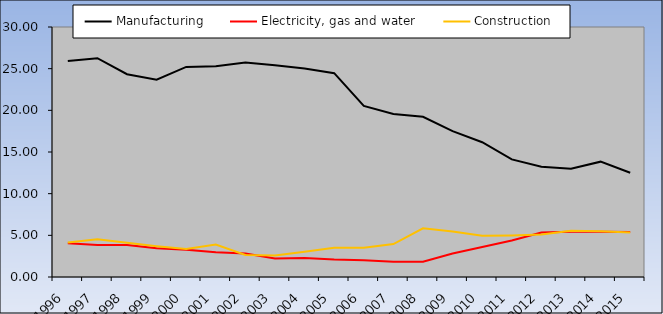
| Category | Manufacturing | Electricity, gas and water | Construction |
|---|---|---|---|
| 1996.0 | 25.912 | 4.046 | 4.13 |
| 1997.0 | 26.254 | 3.839 | 4.526 |
| 1998.0 | 24.332 | 3.825 | 4.102 |
| 1999.0 | 23.687 | 3.458 | 3.696 |
| 2000.0 | 25.213 | 3.273 | 3.37 |
| 2001.0 | 25.295 | 2.956 | 3.886 |
| 2002.0 | 25.729 | 2.829 | 2.638 |
| 2003.0 | 25.418 | 2.232 | 2.595 |
| 2004.0 | 25.006 | 2.279 | 3.03 |
| 2005.0 | 24.459 | 2.093 | 3.495 |
| 2006.0 | 20.522 | 2.021 | 3.499 |
| 2007.0 | 19.557 | 1.834 | 3.957 |
| 2008.0 | 19.218 | 1.826 | 5.841 |
| 2009.0 | 17.509 | 2.821 | 5.471 |
| 2010.0 | 16.176 | 3.595 | 4.943 |
| 2011.0 | 14.113 | 4.373 | 4.995 |
| 2012.0 | 13.24 | 5.326 | 5.087 |
| 2013.0 | 13.001 | 5.436 | 5.555 |
| 2014.0 | 13.842 | 5.429 | 5.489 |
| 2015.0 | 12.508 | 5.389 | 5.346 |